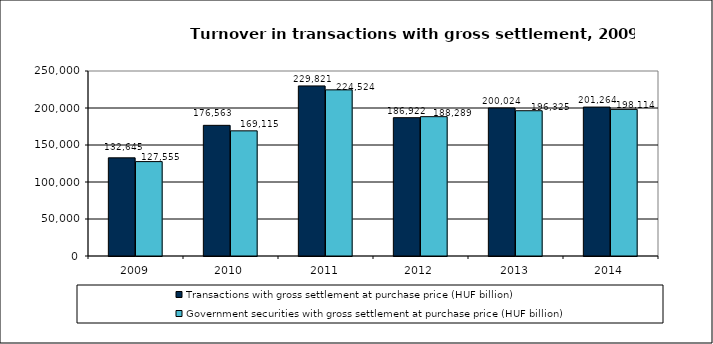
| Category | Transactions with gross settlement at purchase price (HUF billion) | Government securities with gross settlement at purchase price (HUF billion) |
|---|---|---|
| 2009.0 | 132645 | 127555 |
| 2010.0 | 176563 | 169115 |
| 2011.0 | 229821 | 224524 |
| 2012.0 | 186922 | 188289 |
| 2013.0 | 200024 | 196325 |
| 2014.0 | 201264 | 198114 |